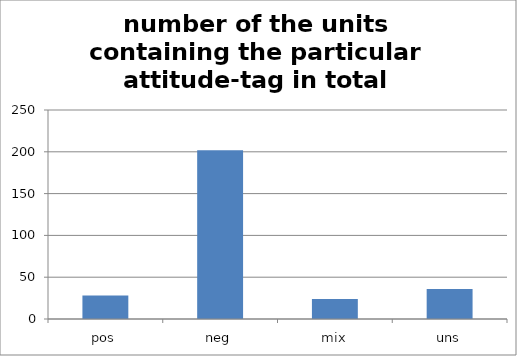
| Category | Series 0 |
|---|---|
| pos | 28 |
| neg | 202 |
| mix | 24 |
| uns | 36 |